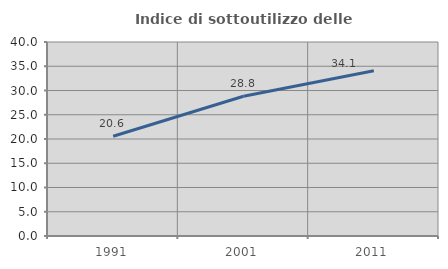
| Category | Indice di sottoutilizzo delle abitazioni  |
|---|---|
| 1991.0 | 20.557 |
| 2001.0 | 28.807 |
| 2011.0 | 34.073 |